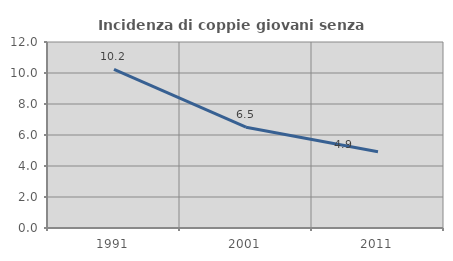
| Category | Incidenza di coppie giovani senza figli |
|---|---|
| 1991.0 | 10.236 |
| 2001.0 | 6.506 |
| 2011.0 | 4.915 |